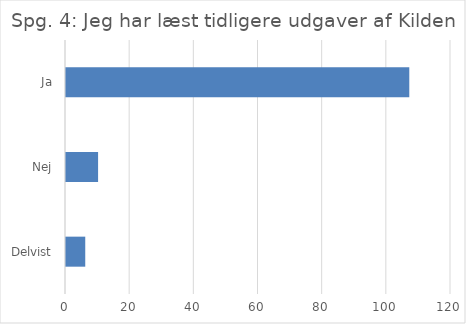
| Category | Svar |
|---|---|
| Delvist | 6 |
| Nej | 10 |
| Ja | 107 |